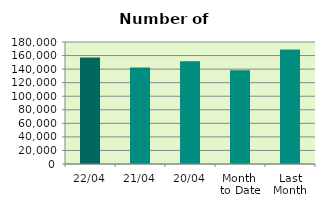
| Category | Series 0 |
|---|---|
| 22/04 | 157008 |
| 21/04 | 142550 |
| 20/04 | 151430 |
| Month 
to Date | 138142.143 |
| Last
Month | 168827.304 |